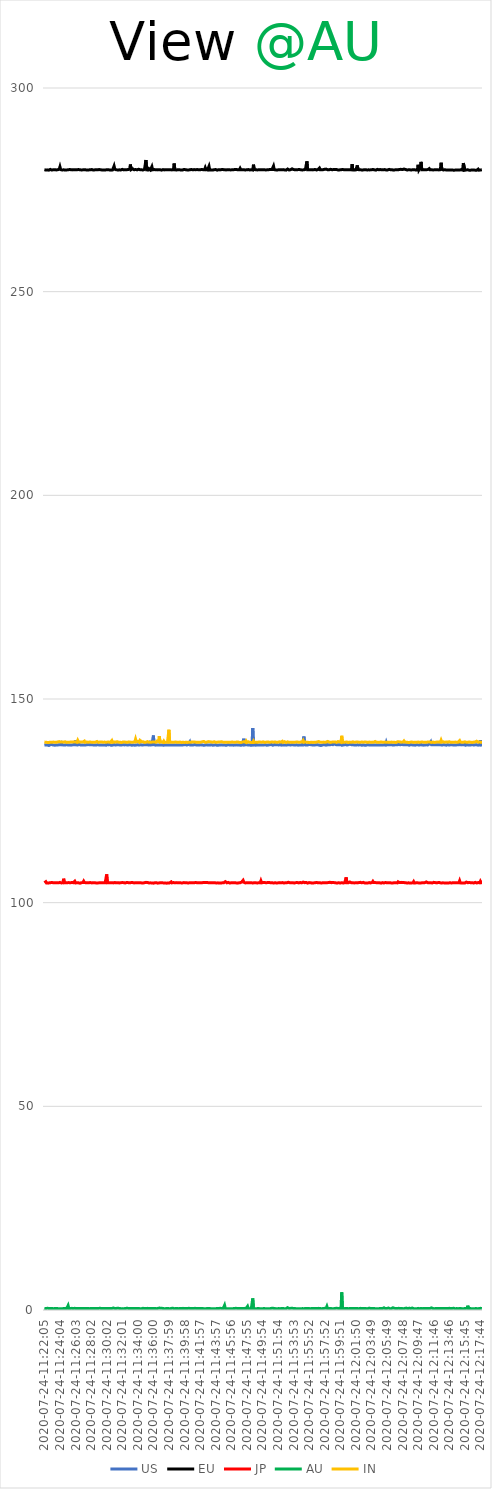
| Category | US | EU | JP | AU | IN |
|---|---|---|---|---|---|
| 2020-07-24-11:22:05 | 138.697 | 279.935 | 104.893 | 0.398 | 139.438 |
| 2020-07-24-11:22:10 | 138.76 | 279.992 | 104.881 | 0.357 | 139.404 |
| 2020-07-24-11:22:16 | 138.711 | 279.856 | 105.151 | 0.353 | 139.372 |
| 2020-07-24-11:22:22 | 138.608 | 279.884 | 104.812 | 0.365 | 139.341 |
| 2020-07-24-11:22:27 | 138.71 | 279.896 | 104.866 | 0.424 | 139.344 |
| 2020-07-24-11:22:33 | 138.663 | 279.936 | 104.797 | 0.404 | 139.363 |
| 2020-07-24-11:22:39 | 138.585 | 279.825 | 104.875 | 0.377 | 139.341 |
| 2020-07-24-11:22:44 | 138.769 | 279.895 | 104.886 | 0.358 | 139.387 |
| 2020-07-24-11:22:50 | 138.783 | 280.006 | 104.904 | 0.384 | 139.394 |
| 2020-07-24-11:22:56 | 138.717 | 279.917 | 104.923 | 0.36 | 139.4 |
| 2020-07-24-11:23:02 | 138.827 | 279.855 | 104.914 | 0.377 | 139.372 |
| 2020-07-24-11:23:07 | 138.725 | 280.011 | 104.921 | 0.417 | 139.372 |
| 2020-07-24-11:23:13 | 138.696 | 279.934 | 104.829 | 0.317 | 139.423 |
| 2020-07-24-11:23:19 | 138.681 | 279.932 | 104.86 | 0.32 | 139.441 |
| 2020-07-24-11:23:24 | 138.664 | 279.951 | 104.813 | 0.367 | 139.392 |
| 2020-07-24-11:23:30 | 138.745 | 279.916 | 104.873 | 0.344 | 139.414 |
| 2020-07-24-11:23:36 | 138.693 | 279.886 | 104.835 | 0.345 | 139.362 |
| 2020-07-24-11:23:41 | 138.756 | 279.969 | 104.864 | 0.367 | 139.362 |
| 2020-07-24-11:23:47 | 138.715 | 279.94 | 104.926 | 0.339 | 139.459 |
| 2020-07-24-11:23:53 | 138.732 | 279.911 | 104.863 | 0.314 | 139.404 |
| 2020-07-24-11:23:58 | 138.767 | 280.041 | 104.946 | 0.319 | 139.537 |
| 2020-07-24-11:24:04 | 138.745 | 280.651 | 104.977 | 0.397 | 139.494 |
| 2020-07-24-11:24:10 | 138.747 | 279.968 | 104.964 | 0.329 | 139.435 |
| 2020-07-24-11:24:15 | 139.099 | 279.949 | 104.846 | 0.315 | 139.415 |
| 2020-07-24-11:24:21 | 138.747 | 279.862 | 104.888 | 0.306 | 139.439 |
| 2020-07-24-11:24:27 | 138.703 | 279.946 | 104.894 | 0.362 | 139.406 |
| 2020-07-24-11:24:32 | 138.713 | 279.922 | 105.882 | 0.371 | 139.4 |
| 2020-07-24-11:24:38 | 138.804 | 279.903 | 104.894 | 0.354 | 139.375 |
| 2020-07-24-11:24:44 | 138.705 | 279.859 | 104.943 | 0.398 | 139.504 |
| 2020-07-24-11:24:49 | 138.842 | 279.87 | 104.9 | 0.365 | 139.369 |
| 2020-07-24-11:24:55 | 138.784 | 279.883 | 104.856 | 0.372 | 139.341 |
| 2020-07-24-11:25:01 | 138.864 | 280.039 | 104.897 | 0.698 | 139.439 |
| 2020-07-24-11:25:06 | 138.699 | 279.921 | 104.874 | 1.087 | 139.399 |
| 2020-07-24-11:25:12 | 138.714 | 279.922 | 104.933 | 0.365 | 139.372 |
| 2020-07-24-11:25:18 | 138.707 | 279.973 | 104.864 | 0.34 | 139.4 |
| 2020-07-24-11:25:23 | 138.743 | 279.897 | 104.872 | 0.362 | 139.417 |
| 2020-07-24-11:25:29 | 138.672 | 279.949 | 104.914 | 0.397 | 139.467 |
| 2020-07-24-11:25:35 | 138.659 | 279.857 | 104.961 | 0.407 | 139.411 |
| 2020-07-24-11:25:41 | 138.746 | 279.898 | 104.833 | 0.412 | 139.429 |
| 2020-07-24-11:25:46 | 138.735 | 279.953 | 104.897 | 0.365 | 139.413 |
| 2020-07-24-11:25:52 | 138.751 | 279.93 | 104.809 | 0.361 | 139.483 |
| 2020-07-24-11:25:58 | 138.885 | 279.952 | 105.26 | 0.408 | 139.417 |
| 2020-07-24-11:26:03 | 139.817 | 279.95 | 104.845 | 0.39 | 139.44 |
| 2020-07-24-11:26:09 | 138.74 | 279.862 | 104.868 | 0.355 | 139.42 |
| 2020-07-24-11:26:15 | 138.76 | 279.95 | 104.872 | 0.357 | 139.374 |
| 2020-07-24-11:26:20 | 138.727 | 279.919 | 104.865 | 0.34 | 139.839 |
| 2020-07-24-11:26:26 | 138.707 | 279.97 | 104.872 | 0.325 | 139.466 |
| 2020-07-24-11:26:32 | 138.842 | 279.9 | 104.921 | 0.349 | 139.395 |
| 2020-07-24-11:26:37 | 138.794 | 279.928 | 104.774 | 0.338 | 139.41 |
| 2020-07-24-11:26:43 | 138.706 | 279.895 | 104.805 | 0.365 | 139.489 |
| 2020-07-24-11:26:49 | 138.709 | 279.873 | 104.909 | 0.333 | 139.43 |
| 2020-07-24-11:26:54 | 138.697 | 279.943 | 104.889 | 0.355 | 139.399 |
| 2020-07-24-11:27:00 | 138.736 | 279.91 | 104.935 | 0.383 | 139.455 |
| 2020-07-24-11:27:06 | 138.729 | 279.945 | 105.282 | 0.341 | 139.397 |
| 2020-07-24-11:27:11 | 138.702 | 279.951 | 104.967 | 0.383 | 139.672 |
| 2020-07-24-11:27:17 | 138.699 | 279.939 | 104.927 | 0.341 | 139.372 |
| 2020-07-24-11:27:23 | 138.729 | 279.894 | 104.879 | 0.344 | 139.392 |
| 2020-07-24-11:27:28 | 138.764 | 279.919 | 104.876 | 0.39 | 139.452 |
| 2020-07-24-11:27:34 | 138.685 | 279.884 | 104.9 | 0.358 | 139.369 |
| 2020-07-24-11:27:40 | 138.813 | 279.972 | 104.873 | 0.357 | 139.37 |
| 2020-07-24-11:27:45 | 138.717 | 279.894 | 104.896 | 0.34 | 139.394 |
| 2020-07-24-11:27:51 | 138.772 | 280.055 | 104.885 | 0.332 | 139.458 |
| 2020-07-24-11:27:57 | 138.699 | 279.939 | 104.94 | 0.363 | 139.399 |
| 2020-07-24-11:28:02 | 138.788 | 279.996 | 105.04 | 0.357 | 139.404 |
| 2020-07-24-11:28:08 | 138.713 | 279.972 | 104.848 | 0.375 | 139.419 |
| 2020-07-24-11:28:14 | 138.748 | 279.886 | 104.868 | 0.349 | 139.386 |
| 2020-07-24-11:28:20 | 138.762 | 279.858 | 104.914 | 0.348 | 139.388 |
| 2020-07-24-11:28:25 | 138.705 | 279.959 | 104.842 | 0.368 | 139.383 |
| 2020-07-24-11:28:31 | 138.772 | 279.905 | 104.894 | 0.315 | 139.455 |
| 2020-07-24-11:28:37 | 138.696 | 279.91 | 104.859 | 0.353 | 139.393 |
| 2020-07-24-11:28:42 | 138.727 | 279.942 | 104.827 | 0.417 | 139.375 |
| 2020-07-24-11:28:48 | 138.741 | 279.997 | 104.85 | 0.357 | 139.571 |
| 2020-07-24-11:28:54 | 138.616 | 279.932 | 104.843 | 0.481 | 139.41 |
| 2020-07-24-11:28:59 | 138.737 | 279.947 | 104.932 | 0.385 | 139.349 |
| 2020-07-24-11:29:05 | 138.737 | 279.978 | 104.875 | 0.41 | 139.533 |
| 2020-07-24-11:29:11 | 138.73 | 279.916 | 104.946 | 0.425 | 139.438 |
| 2020-07-24-11:29:16 | 138.718 | 279.916 | 104.866 | 0.34 | 139.4 |
| 2020-07-24-11:29:22 | 138.705 | 279.866 | 104.996 | 0.343 | 139.471 |
| 2020-07-24-11:29:28 | 138.705 | 279.876 | 104.883 | 0.335 | 139.37 |
| 2020-07-24-11:29:33 | 138.731 | 279.987 | 104.885 | 0.374 | 139.388 |
| 2020-07-24-11:29:39 | 138.747 | 279.878 | 104.917 | 0.364 | 139.423 |
| 2020-07-24-11:29:45 | 138.708 | 279.897 | 104.942 | 0.346 | 139.424 |
| 2020-07-24-11:29:50 | 138.723 | 279.865 | 104.89 | 0.372 | 139.611 |
| 2020-07-24-11:29:56 | 138.664 | 279.912 | 104.941 | 0.381 | 139.384 |
| 2020-07-24-11:30:02 | 138.974 | 279.936 | 106.952 | 0.423 | 139.432 |
| 2020-07-24-11:30:07 | 138.798 | 279.971 | 104.9 | 0.336 | 139.417 |
| 2020-07-24-11:30:13 | 138.739 | 279.939 | 104.92 | 0.359 | 139.451 |
| 2020-07-24-11:30:19 | 138.738 | 279.989 | 104.905 | 0.395 | 139.427 |
| 2020-07-24-11:30:24 | 138.828 | 279.872 | 104.83 | 0.48 | 139.375 |
| 2020-07-24-11:30:30 | 138.726 | 279.901 | 104.912 | 0.397 | 139.357 |
| 2020-07-24-11:30:36 | 138.654 | 279.833 | 104.979 | 0.359 | 139.363 |
| 2020-07-24-11:30:42 | 138.773 | 279.882 | 104.888 | 0.359 | 139.802 |
| 2020-07-24-11:30:47 | 138.68 | 279.885 | 104.873 | 0.334 | 139.349 |
| 2020-07-24-11:30:53 | 138.695 | 279.863 | 104.854 | 0.498 | 139.357 |
| 2020-07-24-11:30:59 | 138.798 | 280.841 | 104.873 | 0.357 | 139.453 |
| 2020-07-24-11:31:04 | 138.742 | 280.047 | 104.939 | 0.372 | 139.347 |
| 2020-07-24-11:31:10 | 138.699 | 279.894 | 104.843 | 0.356 | 139.403 |
| 2020-07-24-11:31:16 | 138.703 | 279.925 | 104.874 | 0.382 | 139.354 |
| 2020-07-24-11:31:21 | 138.787 | 279.978 | 104.91 | 0.353 | 139.523 |
| 2020-07-24-11:31:27 | 138.754 | 279.87 | 104.915 | 0.45 | 139.442 |
| 2020-07-24-11:31:33 | 138.768 | 279.883 | 104.886 | 0.364 | 139.412 |
| 2020-07-24-11:31:38 | 138.732 | 279.911 | 104.846 | 0.379 | 139.344 |
| 2020-07-24-11:31:44 | 138.718 | 279.879 | 104.879 | 0.413 | 139.394 |
| 2020-07-24-11:31:50 | 138.699 | 279.87 | 104.909 | 0.332 | 139.49 |
| 2020-07-24-11:31:55 | 138.707 | 279.973 | 104.806 | 0.318 | 139.305 |
| 2020-07-24-11:32:01 | 138.732 | 280.025 | 104.931 | 0.338 | 139.452 |
| 2020-07-24-11:32:07 | 138.791 | 279.965 | 104.842 | 0.328 | 139.449 |
| 2020-07-24-11:32:12 | 138.752 | 279.899 | 104.915 | 0.312 | 139.513 |
| 2020-07-24-11:32:18 | 138.729 | 279.904 | 104.899 | 0.35 | 139.46 |
| 2020-07-24-11:32:24 | 138.733 | 279.919 | 104.833 | 0.368 | 139.39 |
| 2020-07-24-11:32:29 | 138.759 | 280.045 | 104.831 | 0.331 | 139.383 |
| 2020-07-24-11:32:35 | 138.73 | 279.93 | 104.968 | 0.418 | 139.381 |
| 2020-07-24-11:32:41 | 138.715 | 279.938 | 104.885 | 0.363 | 139.368 |
| 2020-07-24-11:32:46 | 138.84 | 280 | 104.917 | 0.395 | 139.404 |
| 2020-07-24-11:32:52 | 138.743 | 280.005 | 104.915 | 0.39 | 139.469 |
| 2020-07-24-11:32:58 | 138.675 | 280.054 | 104.864 | 0.376 | 139.397 |
| 2020-07-24-11:33:04 | 138.774 | 281.218 | 104.893 | 0.356 | 139.41 |
| 2020-07-24-11:33:09 | 138.681 | 279.955 | 104.926 | 0.368 | 139.425 |
| 2020-07-24-11:33:15 | 138.651 | 279.965 | 104.873 | 0.375 | 139.369 |
| 2020-07-24-11:33:21 | 138.865 | 280.17 | 104.931 | 0.352 | 139.36 |
| 2020-07-24-11:33:26 | 138.719 | 279.955 | 104.883 | 0.409 | 139.422 |
| 2020-07-24-11:33:32 | 138.722 | 279.929 | 104.854 | 0.363 | 139.561 |
| 2020-07-24-11:33:38 | 138.661 | 279.943 | 104.868 | 0.343 | 139.461 |
| 2020-07-24-11:33:43 | 138.737 | 279.997 | 104.872 | 0.376 | 140.137 |
| 2020-07-24-11:33:49 | 138.71 | 279.897 | 105.049 | 0.407 | 139.479 |
| 2020-07-24-11:33:55 | 138.68 | 279.904 | 104.918 | 0.362 | 139.454 |
| 2020-07-24-11:34:00 | 138.752 | 280.002 | 104.85 | 0.374 | 139.605 |
| 2020-07-24-11:34:06 | 138.764 | 280.059 | 104.871 | 0.395 | 139.424 |
| 2020-07-24-11:34:12 | 138.696 | 279.942 | 104.873 | 0.326 | 139.381 |
| 2020-07-24-11:34:17 | 138.661 | 279.946 | 104.908 | 0.315 | 139.835 |
| 2020-07-24-11:34:23 | 138.763 | 279.895 | 104.873 | 0.357 | 139.64 |
| 2020-07-24-11:34:29 | 138.725 | 279.929 | 104.852 | 0.335 | 139.526 |
| 2020-07-24-11:34:34 | 138.691 | 279.971 | 104.852 | 0.374 | 139.365 |
| 2020-07-24-11:34:40 | 138.663 | 279.869 | 104.825 | 0.412 | 139.514 |
| 2020-07-24-11:34:46 | 138.746 | 279.905 | 104.819 | 0.34 | 139.364 |
| 2020-07-24-11:34:51 | 138.807 | 280.024 | 104.902 | 0.359 | 139.345 |
| 2020-07-24-11:34:57 | 138.753 | 279.907 | 104.909 | 0.312 | 139.41 |
| 2020-07-24-11:35:03 | 138.66 | 282.324 | 104.987 | 0.362 | 139.391 |
| 2020-07-24-11:35:08 | 138.801 | 279.906 | 104.89 | 0.389 | 139.62 |
| 2020-07-24-11:35:14 | 138.756 | 279.895 | 104.954 | 0.402 | 139.542 |
| 2020-07-24-11:35:20 | 138.722 | 279.865 | 104.833 | 0.367 | 139.451 |
| 2020-07-24-11:35:25 | 138.77 | 280.205 | 104.846 | 0.373 | 139.368 |
| 2020-07-24-11:35:31 | 139.229 | 279.968 | 104.889 | 0.374 | 139.418 |
| 2020-07-24-11:35:37 | 138.723 | 279.888 | 104.866 | 0.385 | 139.358 |
| 2020-07-24-11:35:43 | 138.721 | 279.854 | 104.898 | 0.369 | 139.383 |
| 2020-07-24-11:35:48 | 138.746 | 280.694 | 104.832 | 0.389 | 139.43 |
| 2020-07-24-11:35:54 | 138.709 | 279.917 | 104.879 | 0.387 | 139.404 |
| 2020-07-24-11:36:00 | 141.033 | 279.859 | 104.788 | 0.365 | 139.415 |
| 2020-07-24-11:36:05 | 138.775 | 279.982 | 104.863 | 0.401 | 139.392 |
| 2020-07-24-11:36:11 | 138.736 | 279.914 | 104.883 | 0.37 | 139.418 |
| 2020-07-24-11:36:17 | 138.674 | 279.917 | 104.878 | 0.353 | 139.392 |
| 2020-07-24-11:36:22 | 138.72 | 279.972 | 104.89 | 0.324 | 139.39 |
| 2020-07-24-11:36:28 | 138.711 | 279.898 | 104.839 | 0.376 | 139.663 |
| 2020-07-24-11:36:34 | 138.694 | 279.926 | 104.796 | 0.4 | 139.439 |
| 2020-07-24-11:36:39 | 138.69 | 279.947 | 104.908 | 0.432 | 139.586 |
| 2020-07-24-11:36:45 | 138.769 | 279.899 | 104.857 | 0.469 | 140.868 |
| 2020-07-24-11:36:51 | 138.714 | 279.941 | 104.856 | 0.385 | 139.393 |
| 2020-07-24-11:36:56 | 138.72 | 279.926 | 104.893 | 0.445 | 139.396 |
| 2020-07-24-11:37:02 | 138.705 | 279.832 | 104.855 | 0.399 | 139.48 |
| 2020-07-24-11:37:08 | 138.718 | 279.94 | 104.867 | 0.399 | 139.419 |
| 2020-07-24-11:37:13 | 138.673 | 279.967 | 104.951 | 0.421 | 139.356 |
| 2020-07-24-11:37:19 | 138.693 | 280.073 | 104.848 | 0.341 | 139.663 |
| 2020-07-24-11:37:25 | 138.677 | 279.894 | 104.884 | 0.335 | 139.337 |
| 2020-07-24-11:37:30 | 138.711 | 279.93 | 104.842 | 0.312 | 139.399 |
| 2020-07-24-11:37:36 | 138.723 | 279.937 | 104.892 | 0.318 | 139.383 |
| 2020-07-24-11:37:42 | 138.714 | 279.879 | 104.784 | 0.383 | 139.38 |
| 2020-07-24-11:37:47 | 138.684 | 279.901 | 104.865 | 0.331 | 139.366 |
| 2020-07-24-11:37:53 | 138.771 | 279.963 | 104.848 | 0.355 | 139.401 |
| 2020-07-24-11:37:59 | 138.677 | 279.908 | 104.856 | 0.314 | 142.452 |
| 2020-07-24-11:38:05 | 138.729 | 279.89 | 104.857 | 0.314 | 139.405 |
| 2020-07-24-11:38:10 | 138.701 | 279.934 | 104.881 | 0.372 | 139.386 |
| 2020-07-24-11:38:16 | 138.764 | 279.909 | 105.108 | 0.373 | 139.417 |
| 2020-07-24-11:38:22 | 138.697 | 279.889 | 104.859 | 0.319 | 139.386 |
| 2020-07-24-11:38:27 | 138.826 | 279.87 | 104.819 | 0.446 | 139.379 |
| 2020-07-24-11:38:33 | 138.714 | 279.929 | 104.931 | 0.331 | 139.449 |
| 2020-07-24-11:38:39 | 138.712 | 281.463 | 104.952 | 0.308 | 139.396 |
| 2020-07-24-11:38:44 | 138.681 | 279.951 | 104.895 | 0.38 | 139.407 |
| 2020-07-24-11:38:50 | 138.715 | 279.954 | 104.811 | 0.389 | 139.453 |
| 2020-07-24-11:38:56 | 138.713 | 279.854 | 104.923 | 0.38 | 139.425 |
| 2020-07-24-11:39:01 | 138.917 | 280.031 | 104.912 | 0.376 | 139.363 |
| 2020-07-24-11:39:07 | 138.7 | 279.945 | 104.88 | 0.311 | 139.361 |
| 2020-07-24-11:39:13 | 138.698 | 279.908 | 104.877 | 0.323 | 139.369 |
| 2020-07-24-11:39:18 | 138.729 | 279.933 | 104.858 | 0.314 | 139.331 |
| 2020-07-24-11:39:24 | 138.713 | 280.095 | 104.91 | 0.38 | 139.431 |
| 2020-07-24-11:39:30 | 138.688 | 279.87 | 104.86 | 0.356 | 139.37 |
| 2020-07-24-11:39:35 | 138.694 | 279.894 | 104.882 | 0.355 | 139.322 |
| 2020-07-24-11:39:41 | 138.714 | 279.846 | 104.842 | 0.296 | 139.336 |
| 2020-07-24-11:39:47 | 138.746 | 279.958 | 104.857 | 0.406 | 139.385 |
| 2020-07-24-11:39:52 | 138.752 | 279.984 | 104.926 | 0.361 | 139.401 |
| 2020-07-24-11:39:58 | 138.724 | 279.928 | 104.909 | 0.345 | 139.339 |
| 2020-07-24-11:40:04 | 138.827 | 279.959 | 104.91 | 0.335 | 139.566 |
| 2020-07-24-11:40:09 | 138.755 | 279.955 | 104.867 | 0.376 | 139.372 |
| 2020-07-24-11:40:15 | 138.706 | 279.89 | 104.879 | 0.375 | 139.445 |
| 2020-07-24-11:40:21 | 138.681 | 279.933 | 104.866 | 0.388 | 139.345 |
| 2020-07-24-11:40:27 | 138.816 | 279.868 | 104.831 | 0.446 | 139.353 |
| 2020-07-24-11:40:32 | 138.749 | 279.918 | 104.86 | 0.406 | 139.408 |
| 2020-07-24-11:40:38 | 139.423 | 279.927 | 104.891 | 0.352 | 139.38 |
| 2020-07-24-11:40:44 | 138.704 | 279.919 | 104.898 | 0.377 | 139.361 |
| 2020-07-24-11:40:49 | 138.682 | 279.983 | 104.868 | 0.396 | 139.336 |
| 2020-07-24-11:40:55 | 138.685 | 279.901 | 104.905 | 0.386 | 139.454 |
| 2020-07-24-11:41:01 | 138.761 | 279.929 | 104.888 | 0.365 | 139.421 |
| 2020-07-24-11:41:06 | 138.727 | 280.024 | 104.889 | 0.347 | 139.432 |
| 2020-07-24-11:41:12 | 138.653 | 279.97 | 104.894 | 0.333 | 139.457 |
| 2020-07-24-11:41:18 | 138.827 | 279.892 | 104.853 | 0.416 | 139.421 |
| 2020-07-24-11:41:23 | 138.692 | 279.933 | 104.956 | 0.381 | 139.315 |
| 2020-07-24-11:41:29 | 138.702 | 279.902 | 104.896 | 0.352 | 139.392 |
| 2020-07-24-11:41:35 | 138.678 | 279.98 | 104.877 | 0.322 | 139.395 |
| 2020-07-24-11:41:40 | 138.709 | 279.978 | 105.003 | 0.357 | 139.369 |
| 2020-07-24-11:41:46 | 138.757 | 279.918 | 104.904 | 0.393 | 139.445 |
| 2020-07-24-11:41:52 | 138.692 | 279.903 | 104.918 | 0.347 | 139.388 |
| 2020-07-24-11:41:57 | 138.707 | 279.918 | 104.891 | 0.392 | 139.57 |
| 2020-07-24-11:42:03 | 138.754 | 279.948 | 104.866 | 0.386 | 139.407 |
| 2020-07-24-11:42:09 | 138.748 | 279.996 | 104.893 | 0.361 | 139.363 |
| 2020-07-24-11:42:14 | 138.703 | 279.948 | 104.837 | 0.384 | 139.507 |
| 2020-07-24-11:42:20 | 138.718 | 279.943 | 104.93 | 0.379 | 139.407 |
| 2020-07-24-11:42:26 | 138.644 | 279.861 | 104.789 | 0.313 | 139.581 |
| 2020-07-24-11:42:31 | 138.707 | 279.915 | 104.924 | 0.359 | 139.367 |
| 2020-07-24-11:42:37 | 138.695 | 280.424 | 105.062 | 0.311 | 139.358 |
| 2020-07-24-11:42:43 | 138.74 | 279.948 | 104.977 | 0.33 | 139.38 |
| 2020-07-24-11:42:48 | 138.75 | 280.011 | 104.847 | 0.346 | 139.422 |
| 2020-07-24-11:42:54 | 138.728 | 279.878 | 104.935 | 0.335 | 139.38 |
| 2020-07-24-11:43:00 | 138.681 | 279.925 | 104.892 | 0.393 | 139.543 |
| 2020-07-24-11:43:06 | 138.748 | 280.776 | 104.867 | 0.407 | 139.465 |
| 2020-07-24-11:43:11 | 138.683 | 279.869 | 104.945 | 0.358 | 139.489 |
| 2020-07-24-11:43:17 | 138.743 | 280.005 | 104.901 | 0.364 | 139.401 |
| 2020-07-24-11:43:23 | 138.763 | 279.87 | 104.844 | 0.304 | 139.449 |
| 2020-07-24-11:43:28 | 138.656 | 280.042 | 104.883 | 0.355 | 139.405 |
| 2020-07-24-11:43:34 | 138.667 | 279.846 | 104.828 | 0.328 | 139.384 |
| 2020-07-24-11:43:40 | 138.77 | 279.864 | 104.896 | 0.375 | 139.391 |
| 2020-07-24-11:43:45 | 138.683 | 279.944 | 104.806 | 0.297 | 139.513 |
| 2020-07-24-11:43:51 | 138.691 | 279.855 | 104.877 | 0.374 | 139.411 |
| 2020-07-24-11:43:57 | 138.77 | 279.987 | 104.848 | 0.336 | 139.383 |
| 2020-07-24-11:44:02 | 138.703 | 279.914 | 104.838 | 0.342 | 139.447 |
| 2020-07-24-11:44:08 | 138.628 | 279.827 | 104.893 | 0.339 | 139.402 |
| 2020-07-24-11:44:14 | 138.653 | 279.95 | 104.866 | 0.31 | 139.326 |
| 2020-07-24-11:44:19 | 138.677 | 279.951 | 104.885 | 0.363 | 139.436 |
| 2020-07-24-11:44:25 | 138.676 | 279.876 | 104.798 | 0.34 | 139.471 |
| 2020-07-24-11:44:31 | 138.71 | 279.894 | 104.868 | 0.418 | 139.453 |
| 2020-07-24-11:44:36 | 138.78 | 279.931 | 104.819 | 0.361 | 139.328 |
| 2020-07-24-11:44:42 | 138.74 | 279.967 | 104.859 | 0.37 | 139.508 |
| 2020-07-24-11:44:48 | 138.739 | 279.909 | 104.883 | 0.365 | 139.328 |
| 2020-07-24-11:44:53 | 138.713 | 279.97 | 104.874 | 0.328 | 139.396 |
| 2020-07-24-11:44:59 | 138.676 | 279.996 | 104.902 | 0.349 | 139.465 |
| 2020-07-24-11:45:05 | 138.705 | 279.928 | 104.905 | 1.155 | 139.391 |
| 2020-07-24-11:45:10 | 138.67 | 279.94 | 105.162 | 0.381 | 139.389 |
| 2020-07-24-11:45:16 | 138.628 | 279.89 | 104.925 | 0.398 | 139.376 |
| 2020-07-24-11:45:22 | 138.694 | 279.862 | 104.87 | 0.325 | 139.428 |
| 2020-07-24-11:45:28 | 138.745 | 279.934 | 104.835 | 0.338 | 139.369 |
| 2020-07-24-11:45:33 | 138.663 | 279.934 | 104.971 | 0.335 | 139.405 |
| 2020-07-24-11:45:39 | 138.74 | 279.932 | 104.915 | 0.343 | 139.408 |
| 2020-07-24-11:45:45 | 138.819 | 279.866 | 104.814 | 0.333 | 139.385 |
| 2020-07-24-11:45:50 | 138.713 | 279.892 | 104.915 | 0.373 | 139.377 |
| 2020-07-24-11:45:56 | 138.737 | 279.948 | 104.882 | 0.331 | 139.426 |
| 2020-07-24-11:46:02 | 138.706 | 279.906 | 104.889 | 0.337 | 139.444 |
| 2020-07-24-11:46:07 | 138.651 | 279.931 | 104.89 | 0.328 | 139.461 |
| 2020-07-24-11:46:13 | 138.666 | 279.931 | 104.864 | 0.325 | 139.387 |
| 2020-07-24-11:46:19 | 138.756 | 279.892 | 104.899 | 0.376 | 139.452 |
| 2020-07-24-11:46:24 | 138.716 | 279.991 | 104.873 | 0.336 | 139.389 |
| 2020-07-24-11:46:30 | 138.689 | 279.83 | 104.871 | 0.406 | 139.39 |
| 2020-07-24-11:46:36 | 138.74 | 279.99 | 104.98 | 0.38 | 139.421 |
| 2020-07-24-11:46:41 | 138.742 | 279.943 | 104.801 | 0.392 | 139.436 |
| 2020-07-24-11:46:47 | 138.699 | 279.912 | 104.865 | 0.373 | 139.465 |
| 2020-07-24-11:46:53 | 138.723 | 279.886 | 104.859 | 0.382 | 139.342 |
| 2020-07-24-11:46:58 | 138.695 | 279.924 | 104.964 | 0.389 | 139.349 |
| 2020-07-24-11:47:04 | 138.626 | 280.274 | 104.896 | 0.34 | 139.449 |
| 2020-07-24-11:47:10 | 138.638 | 279.92 | 104.896 | 0.33 | 139.331 |
| 2020-07-24-11:47:15 | 138.655 | 279.942 | 105.049 | 0.36 | 139.503 |
| 2020-07-24-11:47:21 | 138.719 | 279.934 | 104.841 | 0.356 | 139.411 |
| 2020-07-24-11:47:27 | 138.738 | 279.883 | 105.483 | 0.344 | 139.33 |
| 2020-07-24-11:47:32 | 140.255 | 279.918 | 105.001 | 0.335 | 139.53 |
| 2020-07-24-11:47:38 | 138.714 | 279.899 | 104.836 | 0.401 | 139.393 |
| 2020-07-24-11:47:44 | 138.866 | 279.883 | 104.852 | 0.366 | 139.387 |
| 2020-07-24-11:47:49 | 138.787 | 279.896 | 104.826 | 0.376 | 139.681 |
| 2020-07-24-11:47:55 | 138.758 | 279.922 | 104.876 | 0.353 | 139.341 |
| 2020-07-24-11:48:01 | 138.729 | 279.864 | 104.9 | 0.898 | 139.436 |
| 2020-07-24-11:48:07 | 138.675 | 279.977 | 104.914 | 0.352 | 139.505 |
| 2020-07-24-11:48:12 | 138.707 | 279.946 | 104.907 | 0.436 | 139.594 |
| 2020-07-24-11:48:18 | 138.708 | 279.884 | 104.858 | 0.327 | 139.375 |
| 2020-07-24-11:48:24 | 138.659 | 279.906 | 104.844 | 0.344 | 139.357 |
| 2020-07-24-11:48:29 | 138.676 | 279.92 | 104.885 | 0.286 | 139.323 |
| 2020-07-24-11:48:35 | 138.677 | 279.913 | 104.807 | 0.316 | 139.33 |
| 2020-07-24-11:48:41 | 142.89 | 279.861 | 104.832 | 2.851 | 139.332 |
| 2020-07-24-11:48:46 | 138.735 | 281.182 | 104.862 | 0.328 | 139.675 |
| 2020-07-24-11:48:52 | 138.691 | 279.966 | 104.892 | 0.338 | 139.347 |
| 2020-07-24-11:48:58 | 138.705 | 279.903 | 104.862 | 0.317 | 139.358 |
| 2020-07-24-11:49:03 | 139.431 | 279.949 | 104.888 | 0.385 | 139.391 |
| 2020-07-24-11:49:09 | 138.705 | 279.938 | 104.851 | 0.312 | 139.354 |
| 2020-07-24-11:49:15 | 138.679 | 279.883 | 104.833 | 0.326 | 139.347 |
| 2020-07-24-11:49:20 | 138.695 | 279.908 | 104.809 | 0.372 | 139.39 |
| 2020-07-24-11:49:26 | 138.684 | 279.929 | 104.893 | 0.297 | 139.426 |
| 2020-07-24-11:49:32 | 138.682 | 279.873 | 104.772 | 0.336 | 139.402 |
| 2020-07-24-11:49:37 | 138.63 | 279.928 | 104.868 | 0.335 | 139.424 |
| 2020-07-24-11:49:43 | 138.711 | 279.842 | 105.372 | 0.303 | 139.365 |
| 2020-07-24-11:49:49 | 138.696 | 279.911 | 104.878 | 0.398 | 139.39 |
| 2020-07-24-11:49:54 | 138.723 | 279.963 | 104.887 | 0.3 | 139.422 |
| 2020-07-24-11:50:00 | 138.749 | 279.924 | 104.952 | 0.384 | 139.493 |
| 2020-07-24-11:50:06 | 138.721 | 279.93 | 104.958 | 0.371 | 139.389 |
| 2020-07-24-11:50:11 | 138.704 | 279.91 | 104.95 | 0.34 | 139.342 |
| 2020-07-24-11:50:17 | 138.777 | 279.963 | 104.943 | 0.324 | 139.319 |
| 2020-07-24-11:50:23 | 138.75 | 279.887 | 104.895 | 0.33 | 139.403 |
| 2020-07-24-11:50:29 | 138.658 | 279.98 | 104.915 | 0.336 | 139.41 |
| 2020-07-24-11:50:34 | 138.753 | 279.929 | 104.93 | 0.354 | 139.452 |
| 2020-07-24-11:50:40 | 138.707 | 279.959 | 104.863 | 0.335 | 139.414 |
| 2020-07-24-11:50:46 | 138.775 | 279.959 | 104.958 | 0.327 | 139.403 |
| 2020-07-24-11:50:51 | 138.775 | 279.988 | 104.858 | 0.319 | 139.391 |
| 2020-07-24-11:50:57 | 138.703 | 279.989 | 104.886 | 0.31 | 139.396 |
| 2020-07-24-11:51:03 | 138.861 | 279.982 | 104.863 | 0.393 | 139.425 |
| 2020-07-24-11:51:08 | 138.787 | 279.987 | 104.911 | 0.334 | 139.451 |
| 2020-07-24-11:51:14 | 138.654 | 279.963 | 104.883 | 0.449 | 139.424 |
| 2020-07-24-11:51:20 | 138.735 | 280.824 | 104.827 | 0.306 | 139.396 |
| 2020-07-24-11:51:25 | 138.803 | 279.953 | 104.932 | 0.343 | 139.415 |
| 2020-07-24-11:51:31 | 138.677 | 279.883 | 104.883 | 0.353 | 139.458 |
| 2020-07-24-11:51:37 | 138.766 | 279.892 | 104.892 | 0.336 | 139.423 |
| 2020-07-24-11:51:42 | 138.703 | 279.935 | 104.841 | 0.331 | 139.361 |
| 2020-07-24-11:51:48 | 138.747 | 279.865 | 104.876 | 0.318 | 139.471 |
| 2020-07-24-11:51:54 | 138.726 | 279.912 | 104.862 | 0.343 | 139.401 |
| 2020-07-24-11:51:59 | 138.727 | 279.941 | 104.851 | 0.35 | 139.42 |
| 2020-07-24-11:52:05 | 138.766 | 279.873 | 104.919 | 0.348 | 139.488 |
| 2020-07-24-11:52:11 | 138.761 | 279.913 | 104.885 | 0.319 | 139.418 |
| 2020-07-24-11:52:16 | 139.067 | 280.03 | 104.9 | 0.302 | 139.399 |
| 2020-07-24-11:52:22 | 138.681 | 279.905 | 104.856 | 0.372 | 139.467 |
| 2020-07-24-11:52:28 | 138.673 | 279.918 | 104.926 | 0.424 | 139.621 |
| 2020-07-24-11:52:33 | 138.727 | 279.963 | 104.871 | 0.36 | 139.341 |
| 2020-07-24-11:52:39 | 138.774 | 279.893 | 104.83 | 0.304 | 139.433 |
| 2020-07-24-11:52:45 | 138.72 | 279.887 | 104.975 | 0.314 | 139.517 |
| 2020-07-24-11:52:51 | 138.708 | 279.986 | 104.891 | 0.324 | 139.348 |
| 2020-07-24-11:52:56 | 138.673 | 279.843 | 104.899 | 0.325 | 139.314 |
| 2020-07-24-11:53:02 | 138.719 | 279.982 | 104.885 | 0.359 | 139.415 |
| 2020-07-24-11:53:08 | 138.755 | 280.102 | 104.981 | 0.569 | 139.483 |
| 2020-07-24-11:53:13 | 138.777 | 279.946 | 105.017 | 0.41 | 139.552 |
| 2020-07-24-11:53:19 | 138.771 | 279.869 | 104.907 | 0.371 | 139.373 |
| 2020-07-24-11:53:25 | 138.825 | 279.916 | 104.886 | 0.396 | 139.435 |
| 2020-07-24-11:53:30 | 138.703 | 279.939 | 104.92 | 0.401 | 139.41 |
| 2020-07-24-11:53:36 | 138.731 | 279.908 | 104.898 | 0.404 | 139.605 |
| 2020-07-24-11:53:42 | 138.795 | 280.154 | 104.885 | 0.416 | 139.376 |
| 2020-07-24-11:53:47 | 138.744 | 279.95 | 104.909 | 0.381 | 139.434 |
| 2020-07-24-11:53:53 | 138.727 | 279.975 | 104.852 | 0.386 | 139.405 |
| 2020-07-24-11:53:59 | 138.768 | 279.929 | 104.827 | 0.423 | 139.403 |
| 2020-07-24-11:54:04 | 138.719 | 279.942 | 104.897 | 0.35 | 139.41 |
| 2020-07-24-11:54:10 | 138.74 | 279.923 | 104.915 | 0.378 | 139.384 |
| 2020-07-24-11:54:16 | 138.746 | 279.915 | 104.909 | 0.315 | 139.418 |
| 2020-07-24-11:54:21 | 138.698 | 279.899 | 104.937 | 0.3 | 139.411 |
| 2020-07-24-11:54:27 | 138.672 | 279.96 | 104.864 | 0.329 | 139.415 |
| 2020-07-24-11:54:33 | 138.725 | 279.907 | 104.859 | 0.309 | 139.46 |
| 2020-07-24-11:54:38 | 138.682 | 279.983 | 104.971 | 0.283 | 139.367 |
| 2020-07-24-11:54:44 | 138.728 | 279.971 | 104.947 | 0.326 | 139.496 |
| 2020-07-24-11:54:50 | 138.733 | 279.906 | 104.859 | 0.305 | 139.451 |
| 2020-07-24-11:54:55 | 138.776 | 279.928 | 104.872 | 0.325 | 139.482 |
| 2020-07-24-11:55:01 | 138.729 | 279.89 | 105.032 | 0.346 | 139.431 |
| 2020-07-24-11:55:07 | 138.787 | 279.948 | 105.056 | 0.409 | 139.784 |
| 2020-07-24-11:55:12 | 140.788 | 279.918 | 104.909 | 0.32 | 139.366 |
| 2020-07-24-11:55:18 | 138.753 | 279.942 | 104.904 | 0.353 | 139.439 |
| 2020-07-24-11:55:24 | 138.729 | 280.008 | 104.887 | 0.366 | 139.454 |
| 2020-07-24-11:55:30 | 138.696 | 279.984 | 104.971 | 0.327 | 139.321 |
| 2020-07-24-11:55:35 | 138.724 | 281.99 | 105.011 | 0.368 | 139.376 |
| 2020-07-24-11:55:41 | 138.716 | 279.915 | 104.806 | 0.362 | 139.423 |
| 2020-07-24-11:55:47 | 138.769 | 279.93 | 104.802 | 0.377 | 139.353 |
| 2020-07-24-11:55:52 | 138.877 | 279.908 | 104.925 | 0.418 | 139.375 |
| 2020-07-24-11:55:58 | 138.697 | 279.977 | 104.934 | 0.326 | 139.335 |
| 2020-07-24-11:56:04 | 138.785 | 279.935 | 104.907 | 0.4 | 139.38 |
| 2020-07-24-11:56:09 | 138.718 | 279.881 | 104.919 | 0.342 | 139.381 |
| 2020-07-24-11:56:15 | 138.728 | 279.897 | 104.802 | 0.389 | 139.39 |
| 2020-07-24-11:56:21 | 138.771 | 279.891 | 104.931 | 0.387 | 139.345 |
| 2020-07-24-11:56:26 | 138.697 | 279.924 | 104.849 | 0.344 | 139.44 |
| 2020-07-24-11:56:32 | 138.662 | 279.926 | 104.853 | 0.339 | 139.361 |
| 2020-07-24-11:56:38 | 138.719 | 280.001 | 104.887 | 0.369 | 139.424 |
| 2020-07-24-11:56:43 | 138.691 | 279.943 | 104.878 | 0.383 | 139.372 |
| 2020-07-24-11:56:49 | 138.781 | 279.886 | 104.961 | 0.397 | 139.491 |
| 2020-07-24-11:56:55 | 138.74 | 279.911 | 104.839 | 0.35 | 139.463 |
| 2020-07-24-11:57:00 | 138.744 | 279.97 | 104.881 | 0.534 | 139.44 |
| 2020-07-24-11:57:06 | 138.676 | 279.983 | 104.877 | 0.404 | 139.55 |
| 2020-07-24-11:57:12 | 138.664 | 280.339 | 104.902 | 0.317 | 139.403 |
| 2020-07-24-11:57:17 | 138.73 | 279.945 | 104.936 | 0.359 | 139.381 |
| 2020-07-24-11:57:23 | 138.581 | 279.888 | 104.846 | 0.354 | 139.425 |
| 2020-07-24-11:57:29 | 138.713 | 279.934 | 104.962 | 0.316 | 139.408 |
| 2020-07-24-11:57:34 | 138.709 | 280.02 | 104.862 | 0.39 | 139.339 |
| 2020-07-24-11:57:40 | 138.628 | 279.957 | 104.898 | 0.366 | 139.413 |
| 2020-07-24-11:57:46 | 138.8 | 279.916 | 104.877 | 0.406 | 139.381 |
| 2020-07-24-11:57:52 | 138.819 | 280.048 | 104.95 | 0.404 | 139.408 |
| 2020-07-24-11:57:57 | 138.712 | 279.897 | 104.893 | 0.365 | 139.483 |
| 2020-07-24-11:58:03 | 139.046 | 280.091 | 104.863 | 0.424 | 139.411 |
| 2020-07-24-11:58:09 | 138.719 | 279.977 | 104.913 | 0.874 | 139.37 |
| 2020-07-24-11:58:14 | 138.744 | 279.935 | 105.001 | 0.31 | 139.582 |
| 2020-07-24-11:58:20 | 138.771 | 279.926 | 104.924 | 0.333 | 139.438 |
| 2020-07-24-11:58:26 | 138.785 | 279.928 | 104.966 | 0.343 | 139.442 |
| 2020-07-24-11:58:31 | 138.75 | 279.963 | 105.001 | 0.391 | 139.481 |
| 2020-07-24-11:58:37 | 138.807 | 280.04 | 104.994 | 0.385 | 139.342 |
| 2020-07-24-11:58:43 | 138.881 | 280.006 | 104.915 | 0.322 | 139.382 |
| 2020-07-24-11:58:48 | 138.825 | 279.936 | 104.982 | 0.303 | 139.426 |
| 2020-07-24-11:58:54 | 138.79 | 279.916 | 104.952 | 0.377 | 139.357 |
| 2020-07-24-11:59:00 | 138.783 | 279.987 | 104.944 | 0.325 | 139.465 |
| 2020-07-24-11:59:05 | 139.116 | 280 | 104.918 | 0.337 | 139.399 |
| 2020-07-24-11:59:11 | 138.867 | 279.987 | 104.901 | 0.381 | 139.465 |
| 2020-07-24-11:59:17 | 138.825 | 279.957 | 104.858 | 0.334 | 139.371 |
| 2020-07-24-11:59:22 | 138.747 | 279.983 | 104.957 | 0.432 | 139.353 |
| 2020-07-24-11:59:28 | 138.766 | 280.014 | 104.838 | 0.314 | 139.531 |
| 2020-07-24-11:59:34 | 138.746 | 279.88 | 104.897 | 0.379 | 139.55 |
| 2020-07-24-11:59:39 | 138.706 | 280.007 | 104.889 | 0.308 | 139.493 |
| 2020-07-24-11:59:45 | 138.754 | 279.896 | 104.894 | 0.332 | 139.481 |
| 2020-07-24-11:59:51 | 138.732 | 279.916 | 104.816 | 0.359 | 139.483 |
| 2020-07-24-11:59:56 | 138.776 | 279.932 | 104.974 | 0.322 | 139.359 |
| 2020-07-24-12:00:02 | 139.518 | 280.002 | 104.911 | 4.339 | 140.972 |
| 2020-07-24-12:00:08 | 138.678 | 280.005 | 105.091 | 0.371 | 139.388 |
| 2020-07-24-12:00:14 | 138.634 | 279.919 | 104.827 | 0.307 | 139.4 |
| 2020-07-24-12:00:19 | 138.762 | 279.933 | 104.862 | 0.322 | 139.383 |
| 2020-07-24-12:00:25 | 138.707 | 279.955 | 104.906 | 0.367 | 139.451 |
| 2020-07-24-12:00:31 | 138.818 | 279.951 | 104.951 | 0.381 | 139.411 |
| 2020-07-24-12:00:36 | 138.69 | 279.906 | 106.209 | 0.341 | 139.369 |
| 2020-07-24-12:00:42 | 138.697 | 279.918 | 104.866 | 0.385 | 139.433 |
| 2020-07-24-12:00:48 | 138.745 | 280.036 | 104.857 | 0.343 | 139.445 |
| 2020-07-24-12:00:53 | 138.797 | 279.946 | 104.876 | 0.301 | 139.329 |
| 2020-07-24-12:00:59 | 138.728 | 279.992 | 104.899 | 0.328 | 139.473 |
| 2020-07-24-12:01:05 | 138.905 | 279.9 | 105.07 | 0.388 | 139.414 |
| 2020-07-24-12:01:10 | 138.826 | 279.929 | 104.889 | 0.338 | 139.394 |
| 2020-07-24-12:01:16 | 138.78 | 279.916 | 104.893 | 0.341 | 139.357 |
| 2020-07-24-12:01:22 | 138.823 | 281.293 | 104.876 | 0.382 | 139.415 |
| 2020-07-24-12:01:27 | 138.766 | 279.898 | 104.883 | 0.379 | 139.481 |
| 2020-07-24-12:01:33 | 138.759 | 279.91 | 104.914 | 0.349 | 139.377 |
| 2020-07-24-12:01:39 | 138.711 | 279.866 | 104.843 | 0.346 | 139.361 |
| 2020-07-24-12:01:44 | 138.678 | 279.983 | 104.845 | 0.386 | 139.462 |
| 2020-07-24-12:01:50 | 138.685 | 279.905 | 104.905 | 0.349 | 139.418 |
| 2020-07-24-12:01:56 | 138.778 | 279.9 | 104.799 | 0.348 | 139.447 |
| 2020-07-24-12:02:01 | 138.743 | 280.995 | 104.856 | 0.36 | 139.463 |
| 2020-07-24-12:02:07 | 138.826 | 279.962 | 104.857 | 0.353 | 139.442 |
| 2020-07-24-12:02:13 | 138.729 | 279.882 | 104.922 | 0.322 | 139.387 |
| 2020-07-24-12:02:18 | 138.702 | 279.949 | 104.91 | 0.344 | 139.393 |
| 2020-07-24-12:02:24 | 138.773 | 279.967 | 104.991 | 0.4 | 139.39 |
| 2020-07-24-12:02:30 | 138.843 | 279.908 | 104.861 | 0.317 | 139.439 |
| 2020-07-24-12:02:36 | 138.644 | 279.942 | 104.873 | 0.368 | 139.428 |
| 2020-07-24-12:02:41 | 138.758 | 279.839 | 104.895 | 0.431 | 139.503 |
| 2020-07-24-12:02:47 | 138.749 | 279.915 | 104.98 | 0.335 | 139.401 |
| 2020-07-24-12:02:53 | 138.766 | 279.936 | 104.872 | 0.44 | 139.448 |
| 2020-07-24-12:02:58 | 138.666 | 280.093 | 104.843 | 0.371 | 139.426 |
| 2020-07-24-12:03:04 | 138.756 | 279.951 | 104.933 | 0.392 | 139.462 |
| 2020-07-24-12:03:10 | 138.668 | 279.958 | 104.811 | 0.338 | 139.416 |
| 2020-07-24-12:03:15 | 138.671 | 279.88 | 104.927 | 0.315 | 139.394 |
| 2020-07-24-12:03:21 | 138.803 | 279.976 | 104.836 | 0.331 | 139.35 |
| 2020-07-24-12:03:27 | 138.71 | 279.904 | 104.86 | 0.335 | 139.431 |
| 2020-07-24-12:03:32 | 138.714 | 279.861 | 104.925 | 0.454 | 139.426 |
| 2020-07-24-12:03:38 | 138.71 | 279.896 | 104.841 | 0.366 | 139.344 |
| 2020-07-24-12:03:44 | 138.719 | 279.923 | 104.847 | 0.371 | 139.373 |
| 2020-07-24-12:03:49 | 138.767 | 279.909 | 104.869 | 0.355 | 139.381 |
| 2020-07-24-12:03:55 | 138.698 | 279.878 | 104.963 | 0.393 | 139.413 |
| 2020-07-24-12:04:01 | 138.764 | 279.996 | 105.236 | 0.386 | 139.418 |
| 2020-07-24-12:04:06 | 138.712 | 279.993 | 104.957 | 0.377 | 139.384 |
| 2020-07-24-12:04:12 | 138.753 | 279.909 | 104.847 | 0.346 | 139.431 |
| 2020-07-24-12:04:18 | 138.705 | 279.912 | 104.931 | 0.328 | 139.566 |
| 2020-07-24-12:04:23 | 138.719 | 279.844 | 104.864 | 0.321 | 139.376 |
| 2020-07-24-12:04:29 | 138.704 | 279.854 | 104.906 | 0.316 | 139.397 |
| 2020-07-24-12:04:35 | 138.712 | 280.018 | 104.911 | 0.371 | 139.357 |
| 2020-07-24-12:04:40 | 138.709 | 279.957 | 104.873 | 0.31 | 139.349 |
| 2020-07-24-12:04:46 | 138.725 | 279.943 | 105.038 | 0.375 | 139.421 |
| 2020-07-24-12:04:52 | 138.713 | 279.84 | 104.886 | 0.354 | 139.37 |
| 2020-07-24-12:04:57 | 138.719 | 279.976 | 104.818 | 0.31 | 139.366 |
| 2020-07-24-12:05:03 | 138.727 | 279.94 | 104.8 | 0.349 | 139.466 |
| 2020-07-24-12:05:09 | 138.699 | 279.911 | 104.885 | 0.339 | 139.46 |
| 2020-07-24-12:05:15 | 138.684 | 279.971 | 104.917 | 0.34 | 139.383 |
| 2020-07-24-12:05:20 | 138.723 | 279.922 | 104.873 | 0.378 | 139.438 |
| 2020-07-24-12:05:26 | 138.762 | 279.875 | 104.83 | 0.531 | 139.413 |
| 2020-07-24-12:05:32 | 138.685 | 279.97 | 104.854 | 0.313 | 139.416 |
| 2020-07-24-12:05:37 | 138.686 | 279.919 | 104.949 | 0.322 | 139.411 |
| 2020-07-24-12:05:43 | 139.322 | 279.867 | 104.916 | 0.304 | 139.357 |
| 2020-07-24-12:05:49 | 138.75 | 279.956 | 104.883 | 0.382 | 139.38 |
| 2020-07-24-12:05:54 | 138.724 | 279.886 | 104.892 | 0.372 | 139.343 |
| 2020-07-24-12:06:00 | 138.77 | 279.95 | 104.891 | 0.485 | 139.405 |
| 2020-07-24-12:06:06 | 138.67 | 280.011 | 104.863 | 0.37 | 139.375 |
| 2020-07-24-12:06:11 | 138.745 | 279.951 | 104.91 | 0.329 | 139.391 |
| 2020-07-24-12:06:17 | 138.75 | 279.934 | 104.813 | 0.312 | 139.408 |
| 2020-07-24-12:06:23 | 138.79 | 279.879 | 104.828 | 0.324 | 139.418 |
| 2020-07-24-12:06:28 | 138.749 | 279.918 | 104.888 | 0.423 | 139.383 |
| 2020-07-24-12:06:34 | 138.684 | 279.878 | 104.835 | 0.553 | 139.37 |
| 2020-07-24-12:06:40 | 138.782 | 279.843 | 104.882 | 0.316 | 139.39 |
| 2020-07-24-12:06:45 | 138.73 | 279.921 | 104.911 | 0.413 | 139.374 |
| 2020-07-24-12:06:51 | 138.764 | 279.915 | 104.843 | 0.315 | 139.331 |
| 2020-07-24-12:06:57 | 138.777 | 280 | 104.885 | 0.354 | 139.318 |
| 2020-07-24-12:07:02 | 138.81 | 279.943 | 104.848 | 0.334 | 139.391 |
| 2020-07-24-12:07:08 | 138.758 | 279.907 | 104.858 | 0.368 | 139.484 |
| 2020-07-24-12:07:14 | 138.778 | 279.912 | 105.124 | 0.416 | 139.352 |
| 2020-07-24-12:07:19 | 138.846 | 279.911 | 104.909 | 0.41 | 139.508 |
| 2020-07-24-12:07:25 | 138.801 | 280.015 | 104.931 | 0.428 | 139.439 |
| 2020-07-24-12:07:31 | 138.763 | 279.935 | 104.912 | 0.351 | 139.416 |
| 2020-07-24-12:07:37 | 138.784 | 280.028 | 104.984 | 0.314 | 139.373 |
| 2020-07-24-12:07:42 | 138.849 | 279.934 | 104.942 | 0.376 | 139.41 |
| 2020-07-24-12:07:48 | 138.76 | 279.987 | 104.927 | 0.318 | 139.393 |
| 2020-07-24-12:07:54 | 138.766 | 280.061 | 105.044 | 0.291 | 139.43 |
| 2020-07-24-12:07:59 | 138.766 | 280.099 | 104.926 | 0.364 | 139.681 |
| 2020-07-24-12:08:05 | 138.758 | 279.956 | 104.939 | 0.387 | 139.425 |
| 2020-07-24-12:08:11 | 138.864 | 279.997 | 104.897 | 0.479 | 139.348 |
| 2020-07-24-12:08:16 | 138.76 | 279.901 | 104.944 | 0.46 | 139.407 |
| 2020-07-24-12:08:22 | 138.681 | 279.869 | 104.83 | 0.321 | 139.415 |
| 2020-07-24-12:08:28 | 138.767 | 279.876 | 104.876 | 0.3 | 139.357 |
| 2020-07-24-12:08:33 | 138.705 | 279.915 | 104.87 | 0.314 | 139.34 |
| 2020-07-24-12:08:39 | 138.654 | 279.886 | 104.893 | 0.449 | 139.313 |
| 2020-07-24-12:08:45 | 138.751 | 279.907 | 104.822 | 0.381 | 139.431 |
| 2020-07-24-12:08:50 | 138.802 | 279.921 | 104.817 | 0.346 | 139.418 |
| 2020-07-24-12:08:56 | 138.751 | 279.882 | 104.841 | 0.318 | 139.383 |
| 2020-07-24-12:09:02 | 138.743 | 279.89 | 104.889 | 0.484 | 139.42 |
| 2020-07-24-12:09:07 | 138.692 | 279.932 | 104.874 | 0.388 | 139.417 |
| 2020-07-24-12:09:13 | 138.699 | 279.848 | 105.17 | 0.335 | 139.344 |
| 2020-07-24-12:09:19 | 138.809 | 279.913 | 104.822 | 0.339 | 139.366 |
| 2020-07-24-12:09:24 | 138.669 | 279.911 | 104.887 | 0.308 | 139.373 |
| 2020-07-24-12:09:30 | 138.653 | 279.884 | 104.866 | 0.326 | 139.365 |
| 2020-07-24-12:09:36 | 138.769 | 279.942 | 104.837 | 0.303 | 139.357 |
| 2020-07-24-12:09:41 | 138.652 | 279.9 | 104.869 | 0.345 | 139.403 |
| 2020-07-24-12:09:47 | 138.734 | 281.149 | 104.864 | 0.398 | 139.436 |
| 2020-07-24-12:09:53 | 138.733 | 279.857 | 104.852 | 0.326 | 139.38 |
| 2020-07-24-12:09:59 | 138.696 | 279.881 | 104.888 | 0.322 | 139.347 |
| 2020-07-24-12:10:04 | 138.951 | 280.479 | 104.838 | 0.361 | 139.473 |
| 2020-07-24-12:10:10 | 138.744 | 281.865 | 104.974 | 0.369 | 139.42 |
| 2020-07-24-12:10:16 | 138.731 | 279.92 | 104.869 | 0.379 | 139.338 |
| 2020-07-24-12:10:21 | 138.707 | 280.121 | 104.958 | 0.333 | 139.423 |
| 2020-07-24-12:10:27 | 138.671 | 279.948 | 104.892 | 0.345 | 139.329 |
| 2020-07-24-12:10:33 | 138.69 | 279.974 | 104.864 | 0.367 | 139.386 |
| 2020-07-24-12:10:38 | 138.729 | 279.908 | 104.916 | 0.363 | 139.378 |
| 2020-07-24-12:10:44 | 138.785 | 279.89 | 104.902 | 0.347 | 139.375 |
| 2020-07-24-12:10:50 | 138.743 | 279.957 | 105.088 | 0.362 | 139.353 |
| 2020-07-24-12:10:55 | 138.776 | 279.857 | 104.955 | 0.398 | 139.413 |
| 2020-07-24-12:11:01 | 138.726 | 279.963 | 104.904 | 0.361 | 139.418 |
| 2020-07-24-12:11:07 | 138.703 | 279.965 | 104.868 | 0.394 | 139.43 |
| 2020-07-24-12:11:12 | 138.947 | 280.209 | 104.894 | 0.344 | 139.459 |
| 2020-07-24-12:11:18 | 138.782 | 279.918 | 104.932 | 0.374 | 139.43 |
| 2020-07-24-12:11:24 | 139.476 | 279.857 | 104.891 | 0.425 | 139.411 |
| 2020-07-24-12:11:29 | 138.775 | 279.91 | 104.906 | 0.514 | 139.341 |
| 2020-07-24-12:11:35 | 138.702 | 279.943 | 104.831 | 0.338 | 139.364 |
| 2020-07-24-12:11:41 | 138.739 | 279.894 | 104.926 | 0.36 | 139.435 |
| 2020-07-24-12:11:46 | 138.738 | 279.992 | 104.989 | 0.413 | 139.413 |
| 2020-07-24-12:11:52 | 138.807 | 279.903 | 104.887 | 0.301 | 139.325 |
| 2020-07-24-12:11:58 | 138.716 | 279.941 | 104.925 | 0.324 | 139.462 |
| 2020-07-24-12:12:03 | 138.749 | 279.928 | 104.828 | 0.392 | 139.395 |
| 2020-07-24-12:12:09 | 138.703 | 279.915 | 104.856 | 0.377 | 139.452 |
| 2020-07-24-12:12:15 | 138.769 | 279.944 | 104.91 | 0.379 | 139.463 |
| 2020-07-24-12:12:20 | 138.727 | 279.95 | 104.937 | 0.39 | 139.512 |
| 2020-07-24-12:12:26 | 138.748 | 279.893 | 104.993 | 0.352 | 139.453 |
| 2020-07-24-12:12:32 | 138.763 | 279.97 | 104.925 | 0.34 | 139.401 |
| 2020-07-24-12:12:38 | 138.764 | 279.955 | 104.891 | 0.337 | 139.386 |
| 2020-07-24-12:12:43 | 138.721 | 281.652 | 104.823 | 0.34 | 139.876 |
| 2020-07-24-12:12:49 | 138.686 | 280.083 | 104.954 | 0.361 | 139.408 |
| 2020-07-24-12:12:55 | 138.735 | 279.959 | 104.864 | 0.35 | 139.384 |
| 2020-07-24-12:13:00 | 138.765 | 279.871 | 104.889 | 0.363 | 139.486 |
| 2020-07-24-12:13:06 | 138.756 | 279.942 | 104.856 | 0.435 | 139.387 |
| 2020-07-24-12:13:12 | 138.738 | 279.934 | 104.822 | 0.391 | 139.379 |
| 2020-07-24-12:13:17 | 138.763 | 279.92 | 104.849 | 0.356 | 139.45 |
| 2020-07-24-12:13:23 | 138.668 | 279.873 | 104.938 | 0.372 | 139.464 |
| 2020-07-24-12:13:29 | 138.795 | 279.888 | 104.826 | 0.456 | 139.446 |
| 2020-07-24-12:13:34 | 138.792 | 279.895 | 104.912 | 0.357 | 139.409 |
| 2020-07-24-12:13:40 | 138.785 | 279.865 | 104.833 | 0.355 | 139.426 |
| 2020-07-24-12:13:46 | 138.687 | 279.893 | 104.866 | 0.413 | 139.509 |
| 2020-07-24-12:13:51 | 138.91 | 279.933 | 104.893 | 0.32 | 139.426 |
| 2020-07-24-12:13:57 | 138.771 | 279.859 | 104.832 | 0.333 | 139.375 |
| 2020-07-24-12:14:03 | 138.715 | 279.864 | 104.841 | 0.334 | 139.416 |
| 2020-07-24-12:14:08 | 138.739 | 279.874 | 104.951 | 0.387 | 139.372 |
| 2020-07-24-12:14:14 | 138.824 | 279.925 | 104.888 | 0.384 | 139.424 |
| 2020-07-24-12:14:20 | 138.732 | 279.817 | 104.859 | 0.42 | 139.391 |
| 2020-07-24-12:14:25 | 138.809 | 279.992 | 104.889 | 0.322 | 139.407 |
| 2020-07-24-12:14:31 | 138.737 | 279.845 | 104.865 | 0.319 | 139.421 |
| 2020-07-24-12:14:37 | 138.767 | 279.904 | 104.917 | 0.346 | 139.384 |
| 2020-07-24-12:14:42 | 138.735 | 279.864 | 104.907 | 0.347 | 139.393 |
| 2020-07-24-12:14:48 | 138.701 | 279.798 | 104.916 | 0.342 | 139.403 |
| 2020-07-24-12:14:54 | 138.776 | 279.884 | 104.856 | 0.327 | 139.404 |
| 2020-07-24-12:15:00 | 138.767 | 279.834 | 104.879 | 0.414 | 139.468 |
| 2020-07-24-12:15:05 | 139.195 | 279.855 | 105.381 | 0.356 | 139.778 |
| 2020-07-24-12:15:11 | 138.748 | 279.877 | 104.858 | 0.375 | 139.435 |
| 2020-07-24-12:15:17 | 138.748 | 279.954 | 104.829 | 0.35 | 139.34 |
| 2020-07-24-12:15:22 | 138.736 | 279.852 | 104.835 | 0.322 | 139.371 |
| 2020-07-24-12:15:28 | 138.75 | 279.841 | 104.849 | 0.29 | 139.348 |
| 2020-07-24-12:15:34 | 138.782 | 281.577 | 104.829 | 0.353 | 139.386 |
| 2020-07-24-12:15:39 | 138.699 | 281.349 | 105.003 | 0.337 | 139.415 |
| 2020-07-24-12:15:45 | 138.718 | 279.814 | 104.823 | 0.309 | 139.482 |
| 2020-07-24-12:15:51 | 139.428 | 279.895 | 104.916 | 0.371 | 139.522 |
| 2020-07-24-12:15:56 | 138.708 | 279.892 | 105.056 | 0.378 | 139.381 |
| 2020-07-24-12:16:02 | 138.691 | 279.972 | 104.945 | 0.428 | 139.382 |
| 2020-07-24-12:16:08 | 138.748 | 279.915 | 104.898 | 1.054 | 139.389 |
| 2020-07-24-12:16:13 | 138.723 | 280.019 | 104.877 | 0.311 | 139.536 |
| 2020-07-24-12:16:19 | 138.696 | 279.81 | 104.963 | 0.443 | 139.448 |
| 2020-07-24-12:16:25 | 138.748 | 279.895 | 104.893 | 0.349 | 139.4 |
| 2020-07-24-12:16:30 | 138.718 | 279.831 | 104.894 | 0.37 | 139.377 |
| 2020-07-24-12:16:36 | 138.74 | 279.822 | 104.913 | 0.33 | 139.399 |
| 2020-07-24-12:16:42 | 138.819 | 279.884 | 104.9 | 0.378 | 139.339 |
| 2020-07-24-12:16:47 | 138.677 | 279.977 | 104.948 | 0.334 | 139.414 |
| 2020-07-24-12:16:53 | 138.694 | 279.87 | 104.83 | 0.334 | 139.416 |
| 2020-07-24-12:16:59 | 138.736 | 279.83 | 104.85 | 0.309 | 139.419 |
| 2020-07-24-12:17:04 | 138.758 | 279.823 | 104.977 | 0.363 | 139.445 |
| 2020-07-24-12:17:10 | 138.688 | 279.848 | 104.903 | 0.378 | 139.454 |
| 2020-07-24-12:17:16 | 138.743 | 279.807 | 104.832 | 0.33 | 139.633 |
| 2020-07-24-12:17:22 | 138.746 | 279.82 | 104.887 | 0.29 | 139.59 |
| 2020-07-24-12:17:27 | 138.662 | 280.081 | 104.939 | 0.297 | 139.403 |
| 2020-07-24-12:17:33 | 138.764 | 279.831 | 104.846 | 0.35 | 139.377 |
| 2020-07-24-12:17:39 | 138.767 | 279.992 | 104.866 | 0.44 | 139.436 |
| 2020-07-24-12:17:44 | 139.882 | 279.851 | 105.255 | 0.405 | 139.463 |
| 2020-07-24-12:17:50 | 138.7 | 279.858 | 104.924 | 0.331 | 139.367 |
| 2020-07-24-12:17:56 | 138.742 | 279.932 | 104.845 | 0.374 | 139.333 |
| 2020-07-24-12:18:01 | 138.753 | 279.908 | 104.899 | 0.345 | 139.379 |